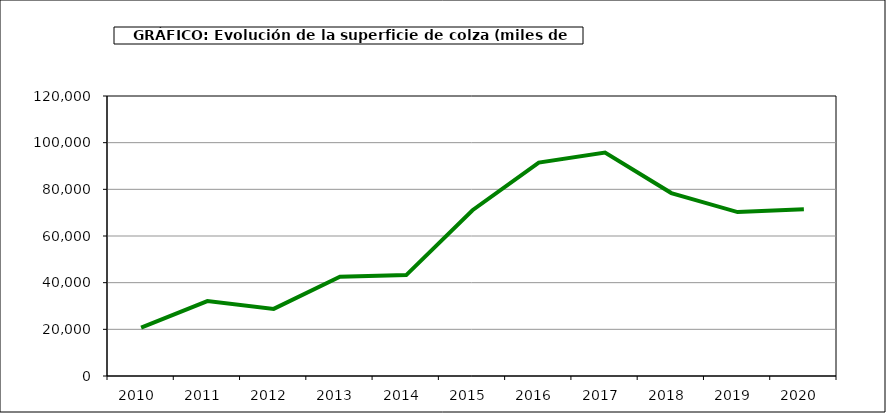
| Category | Superficie |
|---|---|
| 2010.0 | 20731 |
| 2011.0 | 32091 |
| 2012.0 | 28757 |
| 2013.0 | 42549 |
| 2014.0 | 43244 |
| 2015.0 | 71040 |
| 2016.0 | 91459 |
| 2017.0 | 95801 |
| 2018.0 | 78401 |
| 2019.0 | 70255 |
| 2020.0 | 71473 |